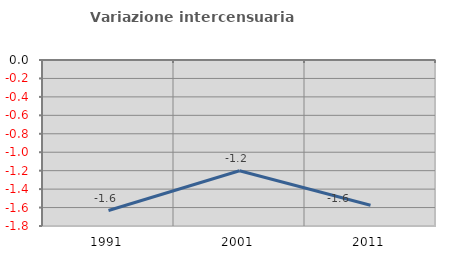
| Category | Variazione intercensuaria annua |
|---|---|
| 1991.0 | -1.632 |
| 2001.0 | -1.201 |
| 2011.0 | -1.575 |